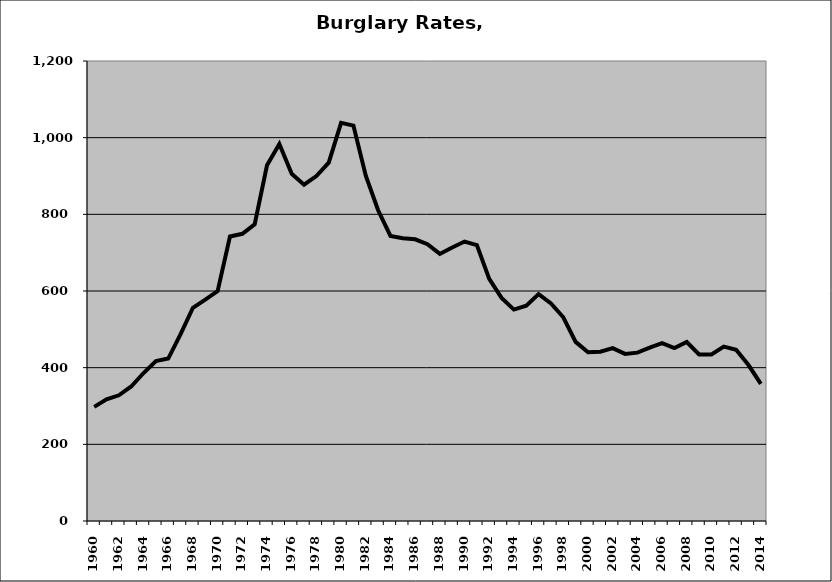
| Category | Burglary |
|---|---|
| 1960.0 | 297.799 |
| 1961.0 | 317.326 |
| 1962.0 | 327.866 |
| 1963.0 | 350.919 |
| 1964.0 | 386.028 |
| 1965.0 | 417.274 |
| 1966.0 | 423.701 |
| 1967.0 | 487.652 |
| 1968.0 | 556.276 |
| 1969.0 | 577.709 |
| 1970.0 | 599.716 |
| 1971.0 | 742.285 |
| 1972.0 | 749.145 |
| 1973.0 | 773.635 |
| 1974.0 | 927.824 |
| 1975.0 | 983.301 |
| 1976.0 | 906.019 |
| 1977.0 | 877.454 |
| 1978.0 | 899.889 |
| 1979.0 | 934.856 |
| 1980.0 | 1038.546 |
| 1981.0 | 1031.457 |
| 1982.0 | 900.691 |
| 1983.0 | 810.635 |
| 1984.0 | 743.778 |
| 1985.0 | 737.509 |
| 1986.0 | 734.814 |
| 1987.0 | 721.992 |
| 1988.0 | 696.691 |
| 1989.0 | 713.663 |
| 1990.0 | 729.057 |
| 1991.0 | 719.622 |
| 1992.0 | 631.476 |
| 1993.0 | 582.047 |
| 1994.0 | 551.51 |
| 1995.0 | 561.754 |
| 1996.0 | 591.88 |
| 1997.0 | 567.537 |
| 1998.0 | 531.431 |
| 1999.0 | 467.208 |
| 2000.0 | 440.353 |
| 2001.0 | 441.718 |
| 2002.0 | 451.057 |
| 2003.0 | 435.85 |
| 2004.0 | 439.252 |
| 2005.0 | 452.498 |
| 2006.0 | 464.117 |
| 2007.0 | 450.888 |
| 2008.0 | 467.016 |
| 2009.0 | 434.534 |
| 2010.0 | 434.336 |
| 2011.0 | 454.851 |
| 2012.0 | 446.865 |
| 2013.0 | 406.845 |
| 2014.0 | 357.545 |